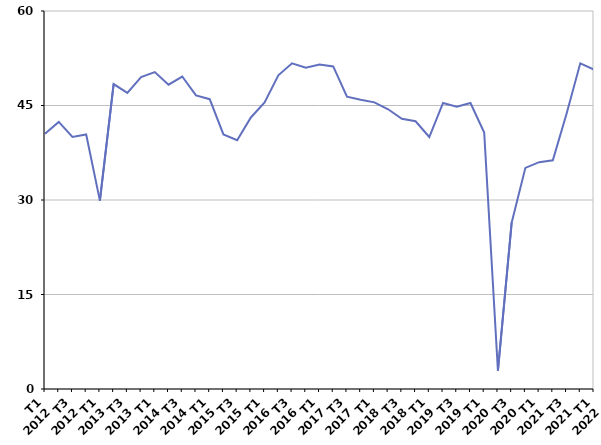
| Category | Radiation administrative |
|---|---|
| T1
2012 | 40.5 |
| T2
2012 | 42.4 |
| T3
2012 | 40 |
| T4
2012 | 40.4 |
| T1
2013 | 29.9 |
| T2
2013 | 48.4 |
| T3
2013 | 47 |
| T4
2013 | 49.5 |
| T1
2014 | 50.3 |
| T2
2014 | 48.3 |
| T3
2014 | 49.6 |
| T4
2014 | 46.6 |
| T1
2015 | 46 |
| T2
2015 | 40.4 |
| T3
2015 | 39.5 |
| T4
2015 | 43.1 |
| T1
2016 | 45.5 |
| T2
2016 | 49.8 |
| T3
2016 | 51.7 |
| T4
2016 | 51 |
| T1
2017 | 51.5 |
| T2
2017 | 51.2 |
| T3
2017 | 46.4 |
| T4
2017 | 45.9 |
| T1
2018 | 45.5 |
| T2
2018 | 44.4 |
| T3
2018 | 42.9 |
| T4
2018 | 42.5 |
| T1
2019 | 40 |
| T2
2019 | 45.4 |
| T3
2019 | 44.8 |
| T4
2019 | 45.4 |
| T1
2020 | 40.7 |
| T2
2020 | 2.9 |
| T3
2020 | 26.4 |
| T4
2020 | 35.1 |
| T1
2021 | 36 |
| T2
2021 | 36.3 |
| T3
2021 | 43.7 |
| T4
2021 | 51.7 |
| T1
2022 | 50.7 |